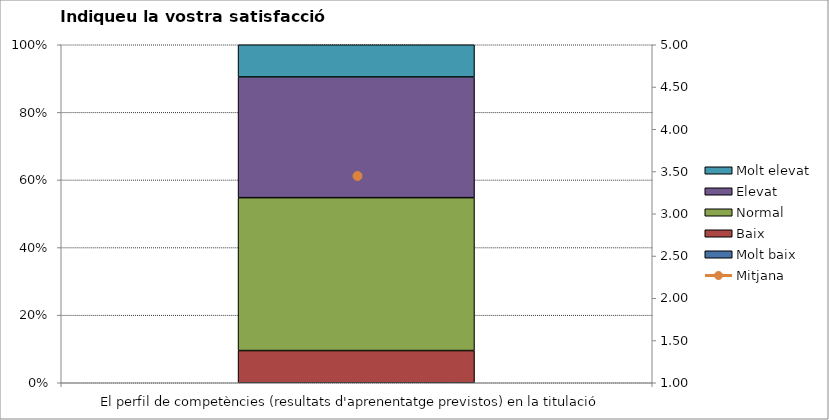
| Category | Molt baix | Baix | Normal  | Elevat | Molt elevat |
|---|---|---|---|---|---|
| El perfil de competències (resultats d'aprenentatge previstos) en la titulació | 0 | 4 | 19 | 15 | 4 |